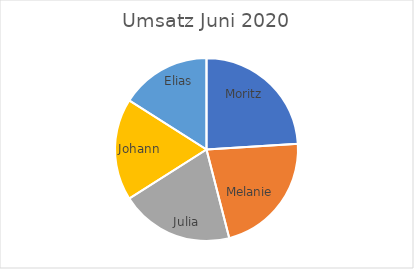
| Category | Umsatz Juni 2020 |
|---|---|
| Moritz | 600 |
| Melanie | 550 |
| Julia | 500 |
| Johann | 450 |
| Elias | 400 |